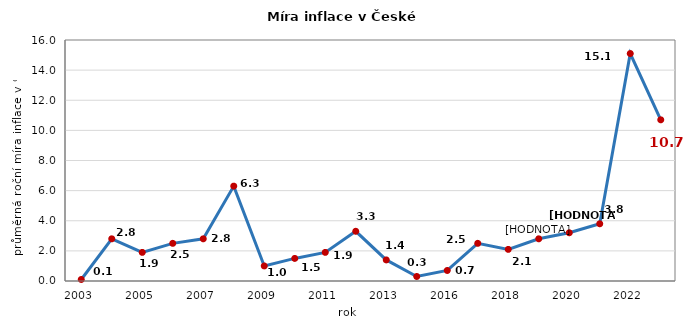
| Category | Series 0 |
|---|---|
| 2003.0 | 0.1 |
| 2004.0 | 2.8 |
| 2005.0 | 1.9 |
| 2006.0 | 2.5 |
| 2007.0 | 2.8 |
| 2008.0 | 6.3 |
| 2009.0 | 1 |
| 2010.0 | 1.5 |
| 2011.0 | 1.9 |
| 2012.0 | 3.3 |
| 2013.0 | 1.4 |
| 2015.0 | 0.3 |
| 2016.0 | 0.7 |
| 2017.0 | 2.5 |
| 2018.0 | 2.1 |
| 2019.0 | 2.8 |
| 2020.0 | 3.2 |
| 2021.0 | 3.8 |
| 2022.0 | 15.1 |
| 2023.0 | 10.7 |